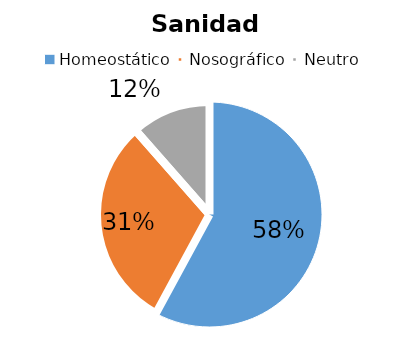
| Category | Series 0 |
|---|---|
| Homeostático | 656 |
| Nosográfico | 347 |
| Neutro | 130 |